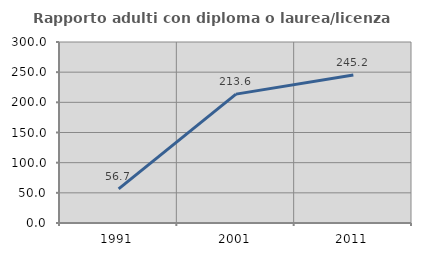
| Category | Rapporto adulti con diploma o laurea/licenza media  |
|---|---|
| 1991.0 | 56.667 |
| 2001.0 | 213.636 |
| 2011.0 | 245.161 |